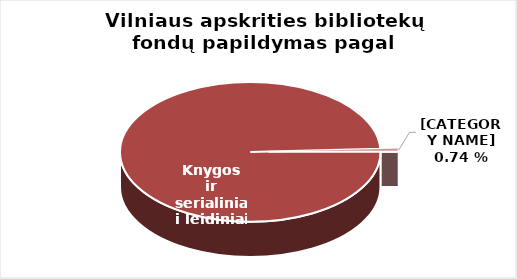
| Category | Series 0 |
|---|---|
| Knygos ir  | 100667 |
| Garsiniai ir regimieji | 746 |